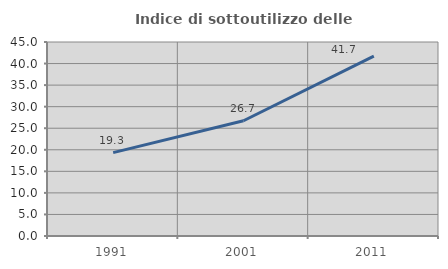
| Category | Indice di sottoutilizzo delle abitazioni  |
|---|---|
| 1991.0 | 19.332 |
| 2001.0 | 26.736 |
| 2011.0 | 41.74 |